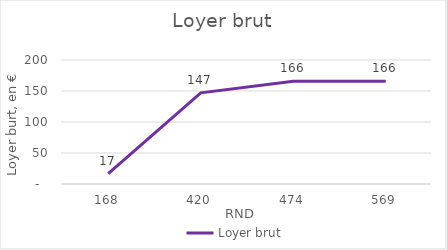
| Category | Loyer brut |
|---|---|
| 167.7146396764919 | 16.771 |
| 420.1631565414553 | 147.057 |
| 473.92534068862346 | 165.874 |
| 568.7104088263482 | 165.874 |